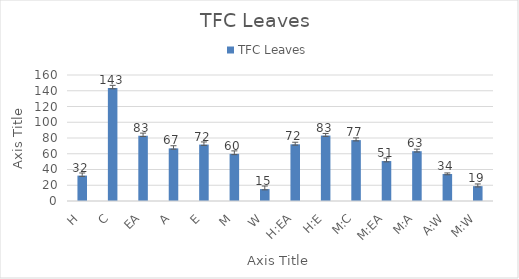
| Category | TFC Leaves  |
|---|---|
| H | 32.236 |
| C | 143.497 |
| EA | 82.868 |
| A | 66.807 |
| E | 71.645 |
| M | 59.861 |
| W | 15.149 |
| H:EA | 71.95 |
| H:E | 83.089 |
| M:C | 77.315 |
| M:EA | 50.731 |
| M:A | 63.228 |
| A:W | 34.287 |
| M:W | 18.847 |